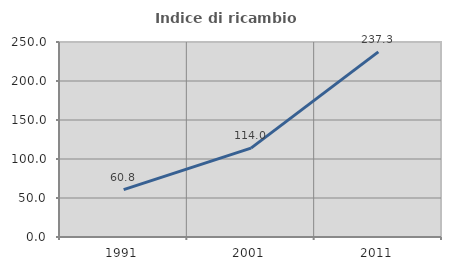
| Category | Indice di ricambio occupazionale  |
|---|---|
| 1991.0 | 60.811 |
| 2001.0 | 113.99 |
| 2011.0 | 237.295 |